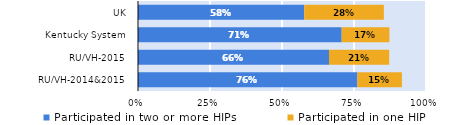
| Category | Participated in two or more HIPs | Participated in one HIP |
|---|---|---|
| RU/VH-2014&2015 | 0.762 | 0.155 |
| RU/VH-2015 | 0.663 | 0.209 |
| Kentucky System | 0.707 | 0.166 |
| UK | 0.577 | 0.276 |